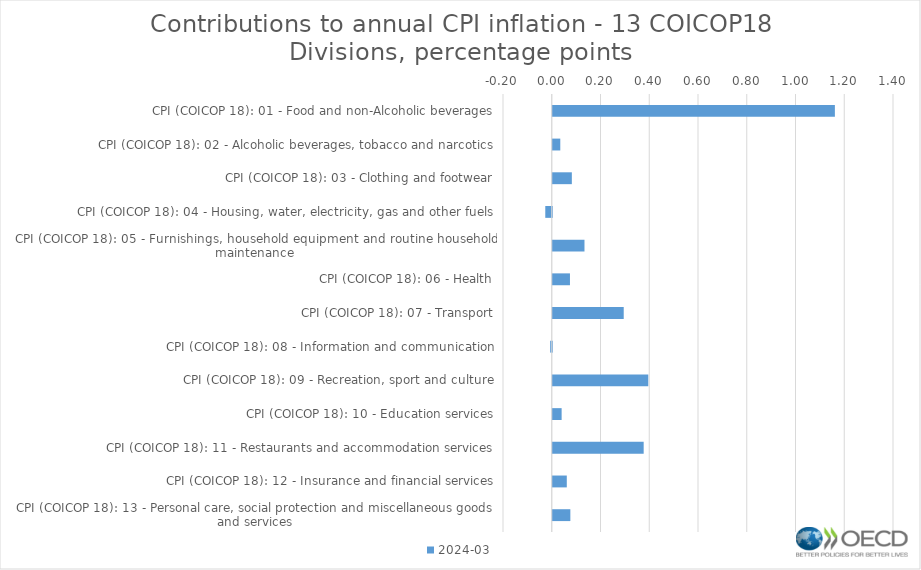
| Category | 2024-03 |
|---|---|
| CPI (COICOP 18): 01 - Food and non-Alcoholic beverages | 1.157 |
| CPI (COICOP 18): 02 - Alcoholic beverages, tobacco and narcotics | 0.031 |
| CPI (COICOP 18): 03 - Clothing and footwear | 0.078 |
| CPI (COICOP 18): 04 - Housing, water, electricity, gas and other fuels | -0.027 |
| CPI (COICOP 18): 05 - Furnishings, household equipment and routine household maintenance | 0.13 |
| CPI (COICOP 18): 06 - Health | 0.071 |
| CPI (COICOP 18): 07 - Transport | 0.291 |
| CPI (COICOP 18): 08 - Information and communication | -0.006 |
| CPI (COICOP 18): 09 - Recreation, sport and culture | 0.392 |
| CPI (COICOP 18): 10 - Education services | 0.036 |
| CPI (COICOP 18): 11 - Restaurants and accommodation services | 0.373 |
| CPI (COICOP 18): 12 - Insurance and financial services | 0.058 |
| CPI (COICOP 18): 13 - Personal care, social protection and miscellaneous goods and services | 0.072 |